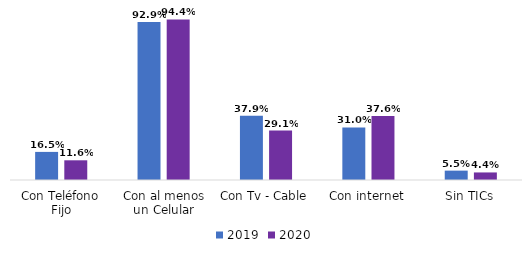
| Category | 2019 | 2020 |
|---|---|---|
| Con Teléfono Fijo | 0.165 | 0.116 |
| Con al menos un Celular | 0.929 | 0.944 |
| Con Tv - Cable | 0.379 | 0.291 |
| Con internet | 0.31 | 0.376 |
| Sin TICs | 0.055 | 0.044 |